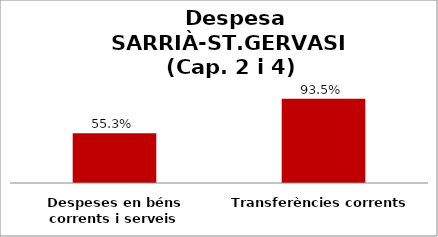
| Category | Series 0 |
|---|---|
| Despeses en béns corrents i serveis | 0.553 |
| Transferències corrents | 0.935 |